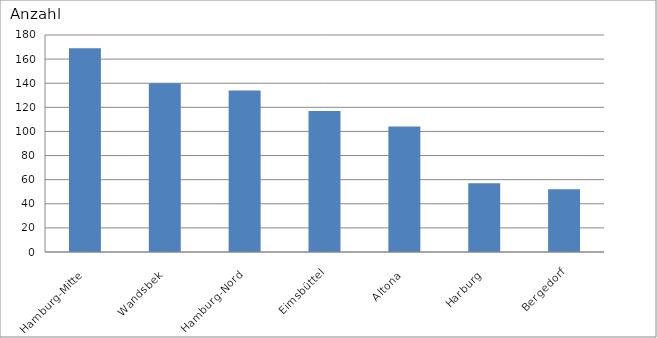
| Category | Hamburg-Mitte Wandsbek Hamburg-Nord Eimsbüttel Altona Harburg Bergedorf |
|---|---|
| Hamburg-Mitte | 169 |
| Wandsbek | 140 |
| Hamburg-Nord | 134 |
| Eimsbüttel | 117 |
| Altona | 104 |
| Harburg | 57 |
| Bergedorf | 52 |